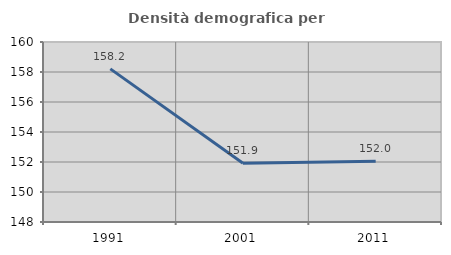
| Category | Densità demografica |
|---|---|
| 1991.0 | 158.209 |
| 2001.0 | 151.919 |
| 2011.0 | 152.042 |